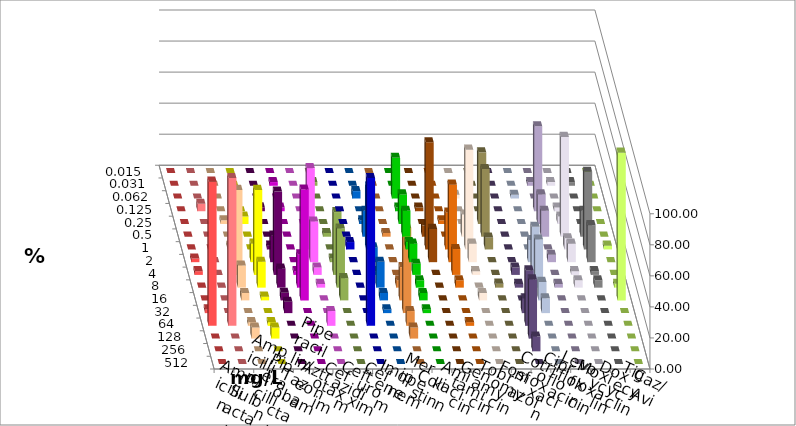
| Category | Ampicillin | Ampicillin/ Sulbactam | Piperacillin | Piperacillin/ Tazobactam | Aztreonam | Cefotaxim | Ceftazidim | Cefuroxim | Imipenem | Meropenem | Colistin | Amikacin | Gentamicin | Tobramycin | Fosfomycin | Cotrimoxazol | Ciprofloxacin | Levofloxacin | Moxifloxacin | Doxycyclin | Tigecyclin | Caz/Avi |
|---|---|---|---|---|---|---|---|---|---|---|---|---|---|---|---|---|---|---|---|---|---|---|
| 0.015 | 0 | 0 | 0 | 0 | 0 | 0 | 0 | 0 | 0 | 0 | 0 | 0 | 0 | 0 | 0 | 0 | 0 | 0 | 0 | 0 | 0 | 0 |
| 0.031 | 0 | 0 | 0 | 0 | 0 | 2.381 | 0 | 0 | 0 | 0 | 0 | 0 | 0 | 0 | 0 | 0 | 2.381 | 2.381 | 2.381 | 0 | 2.381 | 0 |
| 0.062 | 0 | 0 | 0 | 0 | 0 | 0 | 0 | 0 | 4.762 | 26.19 | 0 | 0 | 2.381 | 0 | 0 | 2.381 | 0 | 0 | 0 | 0 | 0 | 0 |
| 0.125 | 0 | 4.762 | 0 | 0 | 2.439 | 2.381 | 0 | 0 | 0 | 2.381 | 2.381 | 0 | 0 | 0 | 0 | 0 | 54.762 | 2.381 | 0 | 0 | 0 | 0 |
| 0.25 | 0 | 0 | 2.381 | 4.762 | 0 | 0 | 0 | 0 | 2.381 | 19.048 | 0 | 2.381 | 0 | 46.154 | 0 | 0 | 19.048 | 4.762 | 0 | 0 | 0 | 0 |
| 0.5 | 0 | 0 | 0 | 0 | 0 | 0 | 4.762 | 0 | 16.667 | 16.667 | 7.143 | 0 | 14.286 | 43.59 | 0 | 0 | 16.667 | 64.286 | 16.667 | 0 | 2.381 | 2.381 |
| 1.0 | 0 | 0 | 2.381 | 0 | 2.439 | 0 | 52.381 | 4.762 | 40.476 | 4.762 | 69.048 | 23.81 | 64.286 | 7.692 | 0 | 0 | 0 | 7.143 | 50 | 2.439 | 0 | 0 |
| 2.0 | 2.381 | 0 | 11.905 | 11.905 | 17.073 | 0 | 26.19 | 0 | 9.524 | 11.905 | 21.429 | 50 | 11.905 | 0 | 0 | 14.286 | 4.762 | 11.905 | 23.81 | 0 | 2.381 | 0 |
| 4.0 | 2.381 | 0 | 54.762 | 54.762 | 53.659 | 2.381 | 4.762 | 0 | 2.381 | 7.143 | 0 | 16.667 | 2.381 | 0 | 4.762 | 30.952 | 0 | 2.381 | 2.381 | 0 | 40.476 | 0 |
| 8.0 | 0 | 0 | 14.286 | 16.667 | 12.195 | 21.429 | 2.381 | 0 | 16.667 | 4.762 | 0 | 4.762 | 0 | 2.564 | 2.381 | 30.952 | 2.381 | 4.762 | 4.762 | 2.439 | 38.095 | 4.762 |
| 16.0 | 0 | 0 | 4.762 | 2.381 | 4.878 | 71.429 | 0 | 0 | 4.762 | 4.762 | 0 | 0 | 4.762 | 0 | 0 | 11.905 | 0 | 0 | 0 | 95.122 | 14.286 | 21.429 |
| 32.0 | 2.381 | 0 | 0 | 0 | 7.317 | 0 | 0 | 0 | 2.381 | 2.381 | 0 | 0 | 0 | 0 | 9.524 | 9.524 | 0 | 0 | 0 | 0 | 0 | 54.762 |
| 64.0 | 92.857 | 95.238 | 2.381 | 2.381 | 0 | 0 | 9.524 | 95.238 | 0 | 0 | 0 | 2.381 | 0 | 0 | 35.714 | 0 | 0 | 0 | 0 | 0 | 0 | 9.524 |
| 128.0 | 0 | 0 | 7.143 | 7.143 | 0 | 0 | 0 | 0 | 0 | 0 | 0 | 0 | 0 | 0 | 38.095 | 0 | 0 | 0 | 0 | 0 | 0 | 7.143 |
| 256.0 | 0 | 0 | 0 | 0 | 0 | 0 | 0 | 0 | 0 | 0 | 0 | 0 | 0 | 0 | 9.524 | 0 | 0 | 0 | 0 | 0 | 0 | 0 |
| 512.0 | 0 | 0 | 0 | 0 | 0 | 0 | 0 | 0 | 0 | 0 | 0 | 0 | 0 | 0 | 0 | 0 | 0 | 0 | 0 | 0 | 0 | 0 |